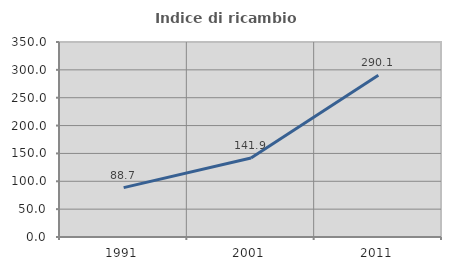
| Category | Indice di ricambio occupazionale  |
|---|---|
| 1991.0 | 88.689 |
| 2001.0 | 141.879 |
| 2011.0 | 290.132 |